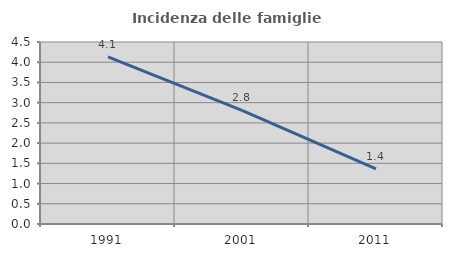
| Category | Incidenza delle famiglie numerose |
|---|---|
| 1991.0 | 4.134 |
| 2001.0 | 2.81 |
| 2011.0 | 1.365 |